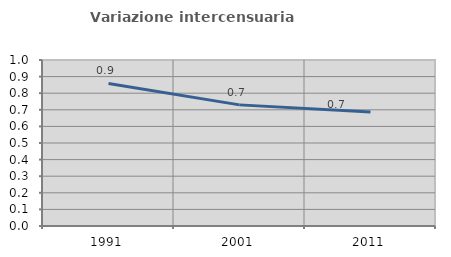
| Category | Variazione intercensuaria annua |
|---|---|
| 1991.0 | 0.859 |
| 2001.0 | 0.73 |
| 2011.0 | 0.687 |